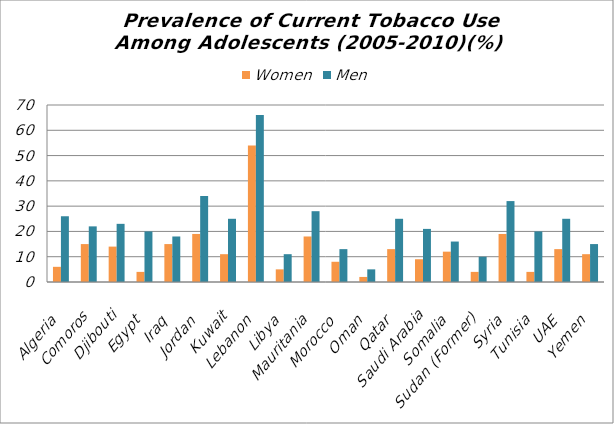
| Category | Women | Men |
|---|---|---|
| Algeria | 6 | 26 |
| Comoros | 15 | 22 |
| Djibouti | 14 | 23 |
| Egypt | 4 | 20 |
| Iraq | 15 | 18 |
| Jordan | 19 | 34 |
| Kuwait | 11 | 25 |
| Lebanon | 54 | 66 |
| Libya | 5 | 11 |
| Mauritania | 18 | 28 |
| Morocco | 8 | 13 |
| Oman | 2 | 5 |
| Qatar | 13 | 25 |
| Saudi Arabia | 9 | 21 |
| Somalia | 12 | 16 |
| Sudan (Former) | 4 | 10 |
| Syria | 19 | 32 |
| Tunisia | 4 | 20 |
| UAE | 13 | 25 |
| Yemen | 11 | 15 |